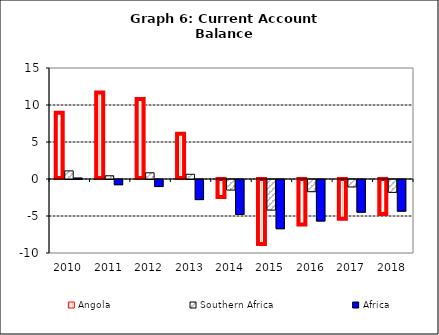
| Category | Angola | Southern Africa | Africa |
|---|---|---|---|
| 2010.0 | 8.957 | 1.095 | 0.144 |
| 2011.0 | 11.705 | 0.439 | -0.706 |
| 2012.0 | 10.818 | 0.839 | -0.95 |
| 2013.0 | 6.101 | 0.638 | -2.715 |
| 2014.0 | -2.555 | -1.429 | -4.722 |
| 2015.0 | -8.925 | -4.138 | -6.65 |
| 2016.0 | -6.286 | -1.65 | -5.608 |
| 2017.0 | -5.496 | -1.011 | -4.418 |
| 2018.0 | -4.848 | -1.744 | -4.278 |